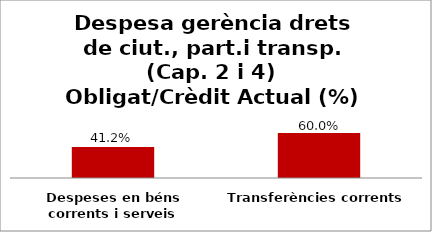
| Category | Series 0 |
|---|---|
| Despeses en béns corrents i serveis | 0.412 |
| Transferències corrents | 0.6 |